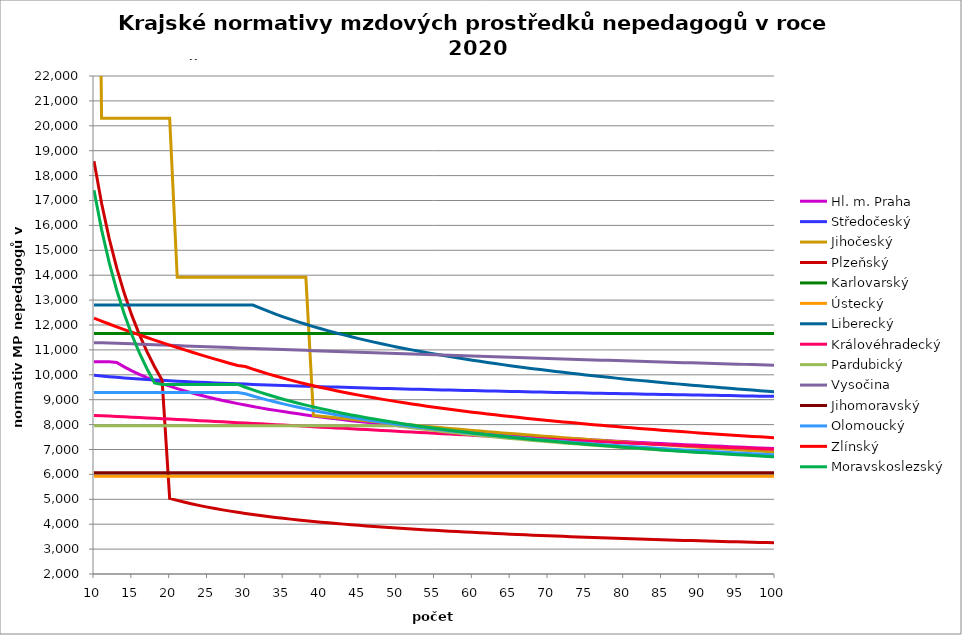
| Category | Hl. m. Praha | Středočeský | Jihočeský | Plzeňský | Karlovarský  | Ústecký   | Liberecký | Královéhradecký | Pardubický | Vysočina | Jihomoravský | Olomoucký | Zlínský | Moravskoslezský |
|---|---|---|---|---|---|---|---|---|---|---|---|---|---|---|
| 10.0 | 10522.629 | 9978.135 | 47853.511 | 18579.73 | 11657.998 | 5928.91 | 12801.653 | 8369.806 | 7955.115 | 11290.607 | 6064.946 | 9286.859 | 12273.645 | 17415 |
| 11.0 | 10522.629 | 9948.942 | 20305.409 | 16890.663 | 11657.998 | 5928.91 | 12801.653 | 8356.329 | 7955.115 | 11290.607 | 6064.946 | 9286.859 | 12156.248 | 15831.818 |
| 12.0 | 10522.629 | 9922.156 | 20305.409 | 15483.108 | 11657.998 | 5928.91 | 12801.653 | 8342.894 | 7955.115 | 11278.536 | 6064.946 | 9286.859 | 12041.076 | 14512.5 |
| 13.0 | 10494.666 | 9897.384 | 20305.409 | 14292.1 | 11657.998 | 5928.91 | 12801.653 | 8326.829 | 7955.115 | 11266.836 | 6064.946 | 9286.859 | 11928.065 | 13396.154 |
| 14.0 | 10318.389 | 9874.321 | 20305.409 | 13271.236 | 11657.998 | 5928.91 | 12801.653 | 8313.489 | 7955.115 | 11254.816 | 6064.946 | 9286.859 | 11817.157 | 12439.286 |
| 15.0 | 10159.276 | 9852.725 | 20305.409 | 12386.486 | 11657.998 | 5928.91 | 12801.653 | 8297.538 | 7955.115 | 11242.822 | 6064.946 | 9286.859 | 11708.291 | 11610 |
| 16.0 | 10014.594 | 9832.404 | 20305.409 | 11612.331 | 11657.998 | 5928.91 | 12801.653 | 8281.647 | 7955.115 | 11230.853 | 6064.946 | 9286.859 | 11601.413 | 10884.375 |
| 17.0 | 9882.188 | 9813.198 | 20305.409 | 10929.253 | 11657.998 | 5928.91 | 12801.653 | 8268.451 | 7955.115 | 11219.251 | 6064.946 | 9286.859 | 11496.469 | 10244.118 |
| 18.0 | 9760.334 | 9794.978 | 20305.409 | 10322.072 | 11657.998 | 5928.91 | 12801.653 | 8252.672 | 7955.115 | 11207.333 | 6064.946 | 9286.859 | 11393.407 | 9675 |
| 19.0 | 9647.632 | 9777.636 | 20305.409 | 9778.805 | 11657.998 | 5928.91 | 12801.653 | 8236.952 | 7955.115 | 11195.779 | 6064.946 | 9286.859 | 11292.175 | 9612.519 |
| 20.0 | 9542.932 | 9761.079 | 20305.409 | 5036.264 | 11657.998 | 5928.91 | 12801.653 | 8221.293 | 7955.115 | 11183.911 | 6064.946 | 9286.859 | 11192.727 | 9612.519 |
| 21.0 | 9445.28 | 9745.229 | 13912.965 | 4955.487 | 11657.998 | 5928.91 | 12801.653 | 8205.693 | 7955.115 | 11172.405 | 6064.946 | 9286.859 | 11095.015 | 9612.519 |
| 22.0 | 9353.876 | 9730.02 | 13912.965 | 4880.724 | 11657.998 | 5928.91 | 12801.653 | 8190.152 | 7955.115 | 11160.586 | 6064.946 | 9286.859 | 10998.995 | 9612.519 |
| 23.0 | 9268.043 | 9715.392 | 13912.965 | 4810.707 | 11657.998 | 5928.91 | 12801.653 | 8174.669 | 7955.115 | 11149.129 | 6064.946 | 9286.859 | 10904.622 | 9612.519 |
| 24.0 | 9187.205 | 9701.297 | 13912.965 | 4745.944 | 11657.998 | 5928.91 | 12801.653 | 8159.245 | 7955.115 | 11137.695 | 6064.946 | 9286.859 | 10811.855 | 9612.519 |
| 25.0 | 9110.865 | 9687.689 | 13912.965 | 4685.296 | 11657.998 | 5928.91 | 12801.653 | 8143.879 | 7955.115 | 11126.284 | 6064.946 | 9286.859 | 10720.653 | 9612.519 |
| 26.0 | 9038.596 | 9674.529 | 13912.965 | 4628.514 | 11657.998 | 5928.91 | 12801.653 | 8128.571 | 7955.115 | 11114.897 | 6064.946 | 9286.859 | 10630.977 | 9612.519 |
| 27.0 | 8970.025 | 9661.784 | 13912.965 | 4574.613 | 11657.998 | 5928.91 | 12801.653 | 8110.785 | 7955.115 | 11103.533 | 6064.946 | 9286.859 | 10542.788 | 9612.519 |
| 28.0 | 8904.827 | 9649.423 | 13912.965 | 4524.93 | 11657.998 | 5928.91 | 12801.653 | 8095.601 | 7955.115 | 11092.193 | 6064.946 | 9286.859 | 10456.051 | 9612.519 |
| 29.0 | 8842.715 | 9637.418 | 13912.965 | 4477.043 | 11657.998 | 5928.91 | 12801.653 | 8077.958 | 7955.115 | 11080.875 | 6064.946 | 9286.859 | 10370.729 | 9612.519 |
| 30.0 | 8783.438 | 9625.745 | 13912.965 | 4431.587 | 11657.998 | 5928.91 | 12801.653 | 8062.896 | 7955.115 | 11069.912 | 6064.946 | 9238.436 | 10330.271 | 9500.918 |
| 31.0 | 8726.77 | 9614.382 | 13912.965 | 4389.146 | 11657.998 | 5928.91 | 12801.729 | 8047.891 | 7955.115 | 11058.64 | 6064.946 | 9149.834 | 10228.135 | 9394.342 |
| 32.0 | 8672.513 | 9603.309 | 13912.965 | 4348.885 | 11657.998 | 5928.91 | 12674.904 | 8030.455 | 7955.115 | 11047.391 | 6064.946 | 9062.916 | 10130.995 | 9293.403 |
| 33.0 | 8620.487 | 9592.507 | 13912.965 | 4310.031 | 11657.998 | 5928.91 | 12554.304 | 8013.095 | 7955.115 | 11036.165 | 6064.946 | 8984.136 | 10038.443 | 9197.619 |
| 34.0 | 8570.533 | 9581.961 | 13912.965 | 4273.193 | 11657.998 | 5928.91 | 12439.426 | 7998.274 | 7955.115 | 11025.29 | 6064.946 | 8906.715 | 9950.118 | 9106.563 |
| 35.0 | 8522.506 | 9571.655 | 13912.965 | 4237.633 | 11657.998 | 5928.91 | 12329.823 | 7981.052 | 7955.115 | 11014.109 | 6064.946 | 8833.761 | 9865.695 | 9019.856 |
| 36.0 | 8476.276 | 9561.576 | 13912.965 | 4203.944 | 11657.998 | 5928.91 | 12225.096 | 7963.904 | 7955.115 | 11003.278 | 6064.946 | 8761.992 | 9784.885 | 8937.159 |
| 37.0 | 8431.724 | 9551.711 | 13912.965 | 4172.053 | 11657.998 | 5928.91 | 12124.887 | 7949.265 | 7955.115 | 10992.141 | 6064.946 | 8694.427 | 9707.428 | 8858.169 |
| 38.0 | 8388.745 | 9542.049 | 13912.965 | 4140.641 | 11657.998 | 5928.91 | 12028.872 | 7932.253 | 7955.115 | 10981.68 | 6064.946 | 8630.898 | 9633.089 | 8782.616 |
| 39.0 | 8347.239 | 9532.579 | 8366.059 | 4110.928 | 11657.998 | 5928.91 | 11936.761 | 7915.314 | 7955.115 | 10970.586 | 6064.946 | 8568.29 | 9561.656 | 8710.254 |
| 40.0 | 8307.117 | 9523.291 | 8334.74 | 4082.245 | 11657.998 | 5928.91 | 11848.29 | 7898.447 | 7955.115 | 10959.841 | 6064.946 | 8509.503 | 9492.936 | 8640.863 |
| 41.0 | 8268.299 | 9514.176 | 8303.73 | 4055.154 | 11657.998 | 5928.91 | 11763.22 | 7881.652 | 7955.115 | 10949.116 | 6064.946 | 8451.516 | 9426.756 | 8574.242 |
| 42.0 | 8230.709 | 9505.226 | 8273.025 | 4028.421 | 11657.998 | 5928.91 | 11681.333 | 7864.929 | 7955.115 | 10938.737 | 6064.946 | 8397.156 | 9362.954 | 8510.21 |
| 43.0 | 8194.277 | 9496.432 | 8242.621 | 4003.203 | 11657.998 | 5928.91 | 11602.43 | 7850.651 | 7955.115 | 10928.054 | 6064.946 | 8343.491 | 9301.386 | 8448.6 |
| 44.0 | 8158.941 | 9487.789 | 8212.513 | 3978.299 | 11657.998 | 5928.91 | 11526.33 | 7834.058 | 7955.115 | 10917.391 | 6064.946 | 8293.28 | 9241.918 | 8389.263 |
| 45.0 | 8124.642 | 9479.288 | 8182.698 | 3954.271 | 11657.998 | 5928.91 | 11452.867 | 7817.535 | 7955.115 | 10906.749 | 6064.946 | 8243.669 | 9184.428 | 8332.059 |
| 46.0 | 8091.325 | 9470.924 | 8153.171 | 3931.656 | 11657.998 | 5928.91 | 11381.886 | 7801.082 | 7955.115 | 10896.128 | 6064.946 | 8194.648 | 9128.804 | 8276.862 |
| 47.0 | 8058.941 | 9462.69 | 8123.93 | 3909.298 | 11657.998 | 5928.91 | 11313.248 | 7784.698 | 7955.115 | 10885.849 | 6064.946 | 8148.883 | 9074.94 | 8223.555 |
| 48.0 | 8027.442 | 9454.582 | 8094.969 | 3887.742 | 11657.998 | 5928.91 | 11246.822 | 7766.058 | 7955.115 | 10875.269 | 6064.946 | 8103.626 | 9022.742 | 8172.032 |
| 49.0 | 7996.786 | 9446.594 | 8066.285 | 3866.423 | 11657.998 | 5928.91 | 11182.49 | 7749.821 | 7955.115 | 10864.709 | 6064.946 | 8058.869 | 8972.122 | 8122.193 |
| 50.0 | 7966.931 | 9438.721 | 8037.874 | 3846.412 | 11657.998 | 5928.91 | 11120.139 | 7733.651 | 7955.115 | 10854.17 | 6064.946 | 8017.195 | 8922.996 | 8073.947 |
| 51.0 | 7937.841 | 9430.959 | 8009.734 | 3826.607 | 11657.998 | 5928.91 | 11059.667 | 7717.549 | 7914.43 | 10844.288 | 6064.946 | 7975.949 | 8875.289 | 8027.21 |
| 52.0 | 7909.479 | 9423.302 | 7981.86 | 3807.533 | 11657.998 | 5928.91 | 11000.978 | 7701.514 | 7874.855 | 10833.788 | 6064.946 | 7935.125 | 8828.93 | 7981.903 |
| 53.0 | 7881.814 | 9415.749 | 7954.248 | 3788.647 | 11657.998 | 5928.91 | 10943.984 | 7685.545 | 7836.4 | 10823.309 | 6064.946 | 7897.23 | 8783.853 | 7937.953 |
| 54.0 | 7854.814 | 9408.293 | 7926.896 | 3770.982 | 11657.998 | 5928.91 | 10888.602 | 7669.642 | 7799.01 | 10813.483 | 6064.946 | 7859.696 | 8739.998 | 7895.292 |
| 55.0 | 7828.45 | 9400.933 | 7899.799 | 3752.968 | 11657.998 | 5928.91 | 10834.754 | 7653.805 | 7762.635 | 10803.359 | 6064.946 | 7822.517 | 8697.305 | 7853.858 |
| 56.0 | 7802.696 | 9393.664 | 7872.955 | 3736.141 | 11657.998 | 5928.91 | 10782.37 | 7635.786 | 7727.229 | 10792.938 | 6064.946 | 7788.132 | 8655.722 | 7813.592 |
| 57.0 | 7777.525 | 9386.483 | 7846.361 | 3719.464 | 11657.998 | 5928.91 | 10731.38 | 7620.088 | 7692.747 | 10782.852 | 6064.946 | 7751.625 | 8615.199 | 7774.438 |
| 58.0 | 7752.914 | 9379.387 | 7820.012 | 3702.936 | 11657.998 | 5928.91 | 10681.723 | 7604.455 | 7659.149 | 10773.1 | 6064.946 | 7717.859 | 8575.688 | 7736.345 |
| 59.0 | 7728.841 | 9372.374 | 7793.907 | 3687.047 | 11657.998 | 5928.91 | 10633.34 | 7588.886 | 7626.395 | 10762.738 | 6064.946 | 7686.768 | 8537.146 | 7699.266 |
| 60.0 | 7705.283 | 9365.44 | 7768.042 | 3671.785 | 11657.998 | 5928.91 | 10586.173 | 7573.38 | 7594.449 | 10752.708 | 6064.946 | 7653.564 | 8499.531 | 7663.155 |
| 61.0 | 7682.221 | 9358.583 | 7742.413 | 3656.649 | 11657.998 | 5928.91 | 10540.173 | 7555.737 | 7563.277 | 10743.01 | 6064.946 | 7622.987 | 8462.803 | 7627.97 |
| 62.0 | 7659.635 | 9351.8 | 7717.018 | 3642.119 | 11657.998 | 5928.91 | 10495.289 | 7540.366 | 7532.848 | 10733.017 | 6064.946 | 7592.654 | 8426.928 | 7593.67 |
| 63.0 | 7637.509 | 9345.09 | 7691.854 | 3627.704 | 11657.998 | 5928.91 | 10451.475 | 7525.058 | 7503.13 | 10723.355 | 6064.946 | 7562.561 | 8391.868 | 7560.219 |
| 64.0 | 7615.824 | 9338.449 | 7666.919 | 3613.878 | 11657.998 | 5928.91 | 10408.688 | 7509.812 | 7474.095 | 10713.399 | 6064.946 | 7532.706 | 8357.593 | 7527.582 |
| 65.0 | 7594.565 | 9331.876 | 7642.208 | 3600.157 | 11657.998 | 5928.91 | 10366.886 | 7494.627 | 7445.717 | 10703.461 | 6064.946 | 7503.085 | 8324.072 | 7495.725 |
| 66.0 | 7573.716 | 9325.369 | 7617.72 | 3586.54 | 11657.998 | 5928.91 | 10326.032 | 7477.349 | 7417.969 | 10694.161 | 6064.946 | 7475.949 | 8291.274 | 7464.616 |
| 67.0 | 7553.263 | 9318.925 | 7593.451 | 3573.489 | 11657.998 | 5928.91 | 10286.088 | 7462.295 | 7390.828 | 10684.259 | 6064.946 | 7449.009 | 8259.173 | 7434.227 |
| 68.0 | 7533.192 | 9312.544 | 7569.4 | 3560.533 | 11657.998 | 5928.91 | 10247.019 | 7447.302 | 7364.271 | 10674.376 | 6064.946 | 7422.262 | 8227.743 | 7404.529 |
| 69.0 | 7513.49 | 9306.222 | 7545.563 | 3548.129 | 11657.998 | 5928.91 | 10208.793 | 7432.369 | 7338.276 | 10664.818 | 6064.946 | 7395.707 | 8196.959 | 7375.495 |
| 70.0 | 7494.144 | 9299.959 | 7521.937 | 3535.811 | 11657.998 | 5928.91 | 10171.378 | 7417.496 | 7312.823 | 10655.278 | 6064.946 | 7369.34 | 8166.797 | 7347.102 |
| 71.0 | 7475.143 | 9293.752 | 7498.521 | 3523.578 | 11657.998 | 5928.91 | 10134.746 | 7402.682 | 7287.892 | 10645.755 | 6064.946 | 7345.336 | 8137.235 | 7319.324 |
| 72.0 | 7456.476 | 9287.6 | 7475.311 | 3511.877 | 11657.998 | 5928.91 | 10098.867 | 7385.824 | 7263.465 | 10636.248 | 6064.946 | 7319.327 | 8108.253 | 7292.14 |
| 73.0 | 7438.131 | 9281.503 | 7452.306 | 3500.255 | 11657.998 | 5928.91 | 10063.716 | 7371.136 | 7239.524 | 10627.065 | 6064.946 | 7295.647 | 8079.829 | 7265.528 |
| 74.0 | 7420.098 | 9275.457 | 7429.502 | 3488.708 | 11657.998 | 5928.91 | 10029.266 | 7356.507 | 7216.052 | 10617.287 | 6064.946 | 7272.12 | 8051.945 | 7239.467 |
| 75.0 | 7402.368 | 9269.462 | 7406.897 | 3477.678 | 11657.998 | 5928.91 | 9995.494 | 7341.935 | 7193.035 | 10607.831 | 6064.946 | 7248.743 | 8024.583 | 7213.939 |
| 76.0 | 7384.93 | 9263.517 | 7384.49 | 3466.717 | 11657.998 | 5928.91 | 9962.378 | 7327.422 | 7170.455 | 10598.697 | 6064.946 | 7225.517 | 7997.725 | 7188.925 |
| 77.0 | 7367.777 | 9257.62 | 7362.277 | 3456.259 | 11657.998 | 5928.91 | 9929.894 | 7312.965 | 7148.299 | 10588.971 | 6064.946 | 7204.531 | 7971.354 | 7164.407 |
| 78.0 | 7350.9 | 9251.771 | 7340.256 | 3445.433 | 11657.998 | 5928.91 | 9898.022 | 7298.565 | 7126.554 | 10579.869 | 6064.946 | 7181.587 | 7945.456 | 7140.369 |
| 79.0 | 7334.289 | 9245.967 | 7318.426 | 3435.103 | 11657.998 | 5928.91 | 9866.743 | 7284.222 | 7105.205 | 10570.48 | 6064.946 | 7160.855 | 7920.015 | 7116.795 |
| 80.0 | 7317.938 | 9240.208 | 7296.783 | 3425.262 | 11657.998 | 5928.91 | 9836.037 | 7269.936 | 7084.241 | 10561.41 | 6064.946 | 7140.242 | 7895.016 | 7093.67 |
| 81.0 | 7301.839 | 9234.492 | 7275.326 | 3415.052 | 11657.998 | 5928.91 | 9805.886 | 7255.705 | 7063.65 | 10552.053 | 6064.946 | 7117.704 | 7870.446 | 7070.979 |
| 82.0 | 7285.985 | 9228.819 | 7254.052 | 3405.325 | 11657.998 | 5928.91 | 9776.273 | 7241.529 | 7043.419 | 10543.015 | 6064.946 | 7097.339 | 7846.291 | 7048.709 |
| 83.0 | 7270.368 | 9223.188 | 7232.96 | 3395.653 | 11657.998 | 5928.91 | 9747.182 | 7227.409 | 7023.538 | 10533.991 | 6064.946 | 7079.11 | 7822.54 | 7026.845 |
| 84.0 | 7254.983 | 9217.597 | 7212.048 | 3386.453 | 11657.998 | 5928.91 | 9718.595 | 7213.344 | 7003.997 | 10524.984 | 6064.946 | 7058.964 | 7799.18 | 7005.377 |
| 85.0 | 7239.822 | 9212.047 | 7191.312 | 3376.888 | 11657.998 | 5928.91 | 9690.499 | 7201.332 | 6984.785 | 10515.692 | 6064.946 | 7038.933 | 7776.199 | 6984.291 |
| 86.0 | 7224.88 | 9206.535 | 7170.752 | 3367.789 | 11657.998 | 5928.91 | 9662.878 | 7187.368 | 6965.892 | 10507.014 | 6064.946 | 7021.002 | 7753.586 | 6963.576 |
| 87.0 | 7210.15 | 9201.061 | 7150.365 | 3359.15 | 11657.998 | 5928.91 | 9635.719 | 7173.459 | 6947.31 | 10497.754 | 6064.946 | 7001.185 | 7731.332 | 6943.221 |
| 88.0 | 7195.628 | 9195.624 | 7130.15 | 3350.146 | 11657.998 | 5928.91 | 9609.009 | 7159.603 | 6929.03 | 10488.808 | 6064.946 | 6983.446 | 7709.425 | 6923.215 |
| 89.0 | 7181.307 | 9190.223 | 7110.104 | 3341.597 | 11657.998 | 5928.91 | 9582.733 | 7147.769 | 6911.042 | 10480.175 | 6064.946 | 6965.796 | 7687.856 | 6903.548 |
| 90.0 | 7167.183 | 9184.858 | 7090.225 | 3332.687 | 11657.998 | 5928.91 | 9556.881 | 7134.012 | 6893.34 | 10471.259 | 6064.946 | 6946.29 | 7666.615 | 6884.211 |
| 91.0 | 7153.25 | 9179.528 | 7070.512 | 3324.628 | 11657.998 | 5928.91 | 9531.44 | 7120.307 | 6875.914 | 10462.358 | 6064.946 | 6928.827 | 7645.694 | 6865.193 |
| 92.0 | 7139.503 | 9174.231 | 7050.963 | 3316.208 | 11657.998 | 5928.91 | 9506.4 | 7108.603 | 6858.758 | 10453.472 | 6064.946 | 6911.452 | 7625.083 | 6846.487 |
| 93.0 | 7125.938 | 9168.968 | 7031.577 | 3307.831 | 11657.998 | 5928.91 | 9481.748 | 7094.996 | 6841.863 | 10444.897 | 6064.946 | 6896.08 | 7604.775 | 6828.083 |
| 94.0 | 7112.55 | 9163.738 | 7012.35 | 3299.892 | 11657.998 | 5928.91 | 9457.474 | 7083.374 | 6825.224 | 10435.746 | 6064.946 | 6878.869 | 7584.762 | 6809.972 |
| 95.0 | 7099.336 | 9158.54 | 6993.282 | 3291.991 | 11657.998 | 5928.91 | 9433.57 | 7069.864 | 6808.833 | 10427.2 | 6064.946 | 6861.743 | 7565.035 | 6792.148 |
| 96.0 | 7086.29 | 9153.373 | 6974.37 | 3284.128 | 11657.998 | 5928.91 | 9410.023 | 7058.324 | 6792.684 | 10418.668 | 6064.946 | 6844.702 | 7545.588 | 6774.602 |
| 97.0 | 7073.408 | 9148.236 | 6955.614 | 3276.692 | 11657.998 | 5928.91 | 9386.826 | 7046.822 | 6776.771 | 10409.856 | 6064.946 | 6829.626 | 7526.412 | 6757.326 |
| 98.0 | 7060.687 | 9143.13 | 6937.011 | 3268.902 | 11657.998 | 5928.91 | 9363.969 | 7033.451 | 6761.087 | 10401.352 | 6064.946 | 6814.615 | 7507.502 | 6740.315 |
| 99.0 | 7048.123 | 9138.053 | 6918.559 | 3261.535 | 11657.998 | 5928.91 | 9341.444 | 7022.03 | 6745.627 | 10392.862 | 6064.946 | 6797.808 | 7488.851 | 6723.56 |
| 100.0 | 7035.713 | 9133.006 | 6900.258 | 3254.201 | 11657.998 | 5928.91 | 9319.242 | 7010.646 | 6730.385 | 10384.094 | 6064.946 | 6782.937 | 7470.451 | 6707.055 |